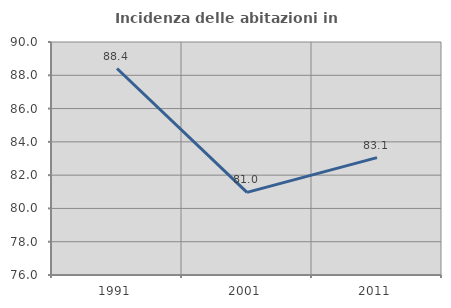
| Category | Incidenza delle abitazioni in proprietà  |
|---|---|
| 1991.0 | 88.406 |
| 2001.0 | 80.964 |
| 2011.0 | 83.056 |